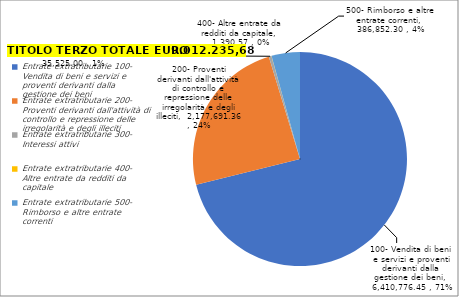
| Category | Series 1 | Series 0 |
|---|---|---|
| 0 | 6410776.45 | 5570359 |
| 1 | 2177691.36 | 4965059.36 |
| 2 | 35525 | 35525 |
| 3 | 1390.57 | 1390.57 |
| 4 | 386852.3 | 349023.3 |